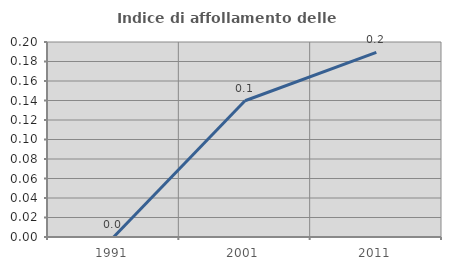
| Category | Indice di affollamento delle abitazioni  |
|---|---|
| 1991.0 | 0 |
| 2001.0 | 0.14 |
| 2011.0 | 0.189 |